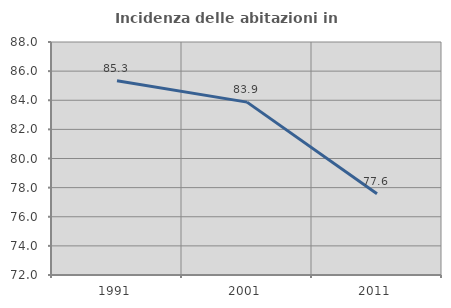
| Category | Incidenza delle abitazioni in proprietà  |
|---|---|
| 1991.0 | 85.345 |
| 2001.0 | 83.871 |
| 2011.0 | 77.586 |